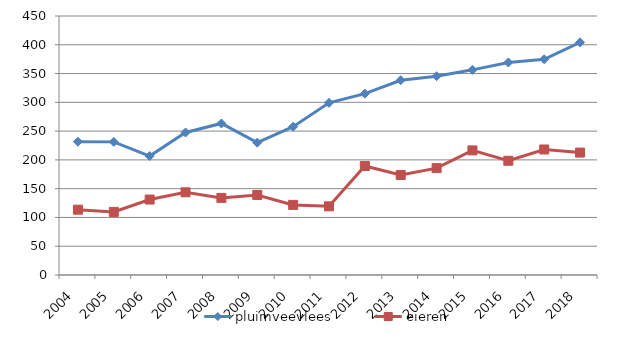
| Category | pluimveevlees | eieren |
|---|---|---|
| 2004.0 | 231.6 | 113.5 |
| 2005.0 | 231.3 | 109.6 |
| 2006.0 | 206.7 | 131.1 |
| 2007.0 | 247.6 | 143.7 |
| 2008.0 | 263.3 | 134 |
| 2009.0 | 229.9 | 139.1 |
| 2010.0 | 257.7 | 121.8 |
| 2011.0 | 299.2 | 119.3 |
| 2012.0 | 315.1 | 189.4 |
| 2013.0 | 338.4 | 173.8 |
| 2014.0 | 345.4 | 185.7 |
| 2015.0 | 356.437 | 216.5 |
| 2016.0 | 369.275 | 198.5 |
| 2017.0 | 374.8 | 218.1 |
| 2018.0 | 404.2 | 212.7 |